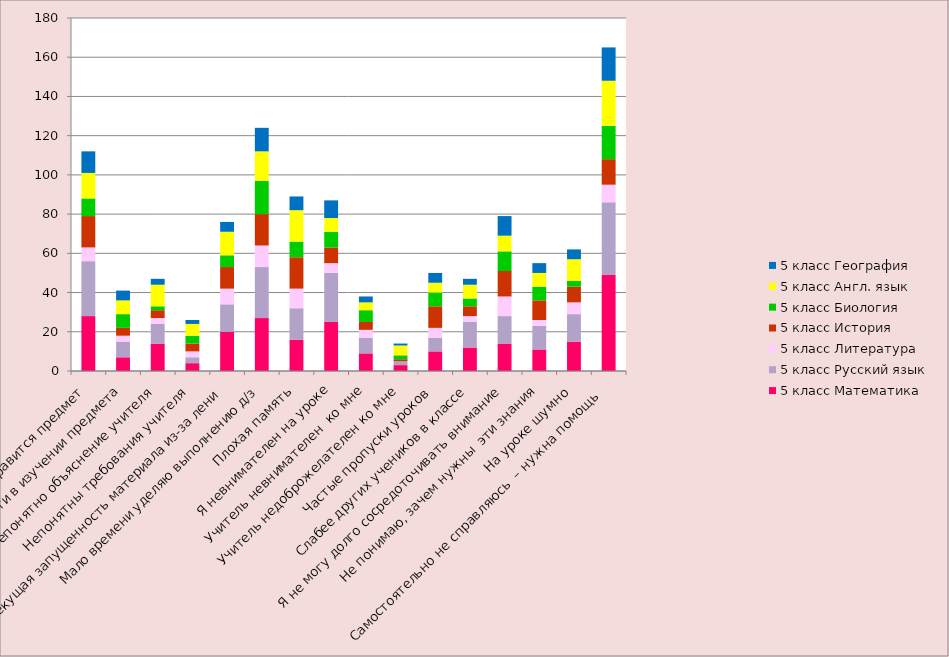
| Category | 5 класс Математика | 5 класс Русский язык | 5 класс Литература | 5 класс История | 5 класс Биология | 5 класс Англ. язык | 5 класс География |
|---|---|---|---|---|---|---|---|
| Не нравится предмет | 28 | 28 | 7 | 16 | 9 | 13 | 11 |
| Нет потребности в изучении предмета | 7 | 8 | 3 | 4 | 7 | 7 | 5 |
| Непонятно объяснение учителя | 14 | 10 | 3 | 4 | 2 | 11 | 3 |
| Непонятны требования учителя | 4 | 3 | 3 | 4 | 4 | 6 | 2 |
| Текущая запущенность материала из-за лени | 20 | 14 | 8 | 11 | 6 | 12 | 5 |
| Мало времени уделяю выполнению д/з | 27 | 26 | 11 | 16 | 17 | 15 | 12 |
| Плохая память | 16 | 16 | 10 | 16 | 8 | 16 | 7 |
| Я невнимателен на уроке | 25 | 25 | 5 | 8 | 8 | 7 | 9 |
| Учитель невнимателен  ко мне | 9 | 8 | 4 | 4 | 6 | 4 | 3 |
| Учитель недоброжелателен ко мне | 3 | 2 | 0 | 1 | 2 | 5 | 1 |
| Частые пропуски уроков | 10 | 7 | 5 | 11 | 7 | 5 | 5 |
| Слабее других учеников в классе | 12 | 13 | 3 | 5 | 4 | 7 | 3 |
| Я не могу долго сосредоточивать внимание | 14 | 14 | 10 | 13 | 10 | 8 | 10 |
| Не понимаю, зачем нужны  эти знания | 11 | 12 | 3 | 10 | 7 | 7 | 5 |
| На уроке шумно | 15 | 14 | 6 | 8 | 3 | 11 | 5 |
| Самостоятельно не справляюсь  – нужна помощь  | 49 | 37 | 9 | 13 | 17 | 23 | 17 |